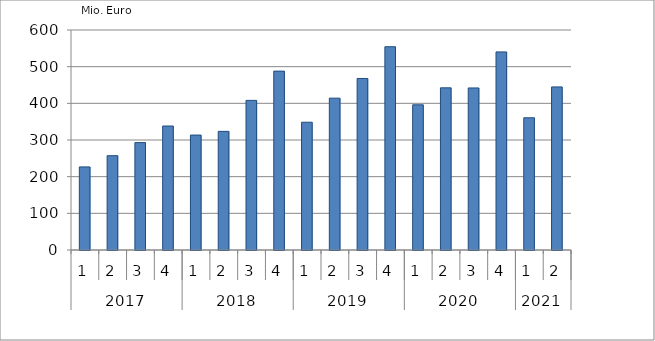
| Category | Ausbaugewerblicher Umsatz3 |
|---|---|
| 0 | 226552.317 |
| 1 | 257191.13 |
| 2 | 292853.372 |
| 3 | 338154.691 |
| 4 | 313433.569 |
| 5 | 323547.694 |
| 6 | 408057.42 |
| 7 | 487843.765 |
| 8 | 348466.115 |
| 9 | 414145.554 |
| 10 | 467849.207 |
| 11 | 554369.34 |
| 12 | 395996.128 |
| 13 | 442270.528 |
| 14 | 441987.109 |
| 15 | 540250.513 |
| 16 | 360578.959 |
| 17 | 444796.964 |